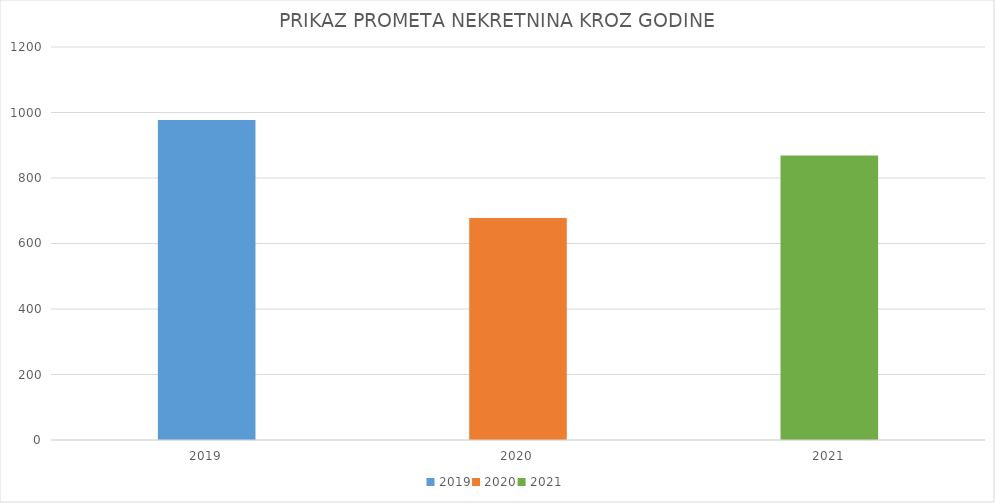
| Category | BROJ UGOVORA |
|---|---|
| 0 | 977 |
| 1 | 678 |
| 2 | 869 |